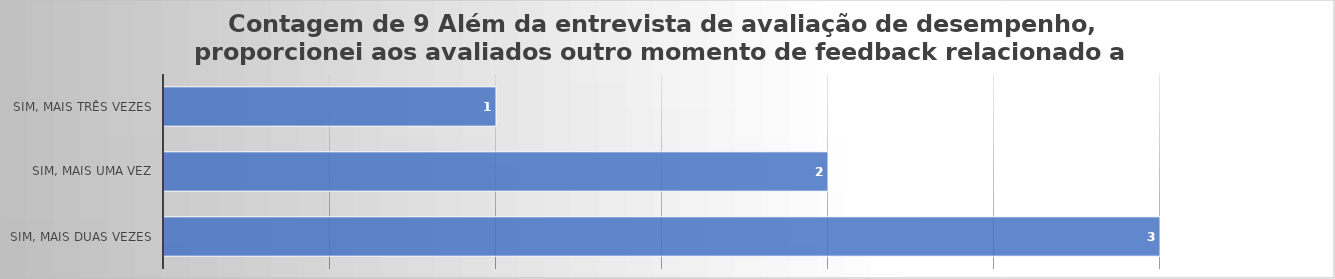
| Category | Contagem de 9 Além da entrevista de avaliação de desempenho, proporcionei aos avaliados outro momento de feedback relacionado a avaliação de desempenho? |
|---|---|
| Sim, mais duas vezes | 3 |
| Sim, mais uma vez | 2 |
| Sim, mais três vezes | 1 |